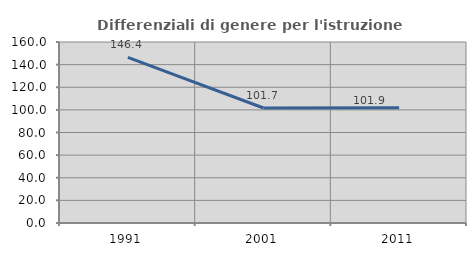
| Category | Differenziali di genere per l'istruzione superiore |
|---|---|
| 1991.0 | 146.353 |
| 2001.0 | 101.656 |
| 2011.0 | 101.95 |